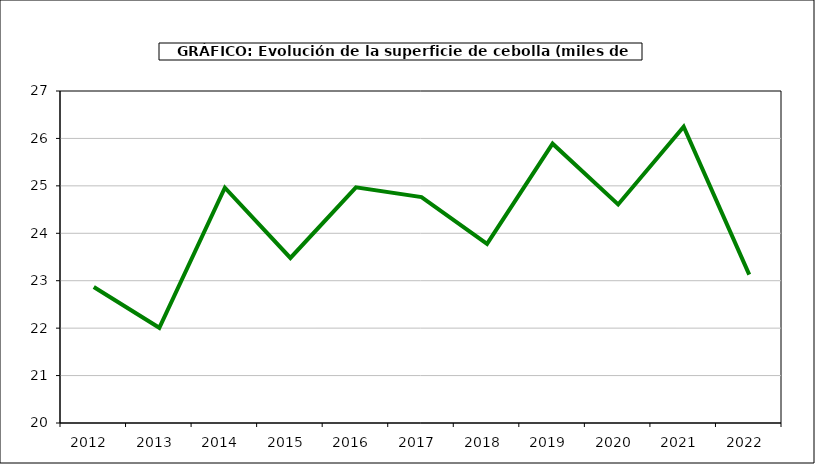
| Category | superficie |
|---|---|
| 2012.0 | 22.867 |
| 2013.0 | 22.008 |
| 2014.0 | 24.961 |
| 2015.0 | 23.48 |
| 2016.0 | 24.969 |
| 2017.0 | 24.762 |
| 2018.0 | 23.775 |
| 2019.0 | 25.889 |
| 2020.0 | 24.608 |
| 2021.0 | 26.248 |
| 2022.0 | 23.128 |